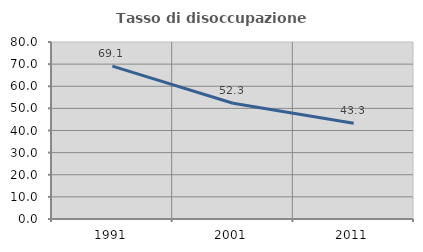
| Category | Tasso di disoccupazione giovanile  |
|---|---|
| 1991.0 | 69.108 |
| 2001.0 | 52.304 |
| 2011.0 | 43.296 |